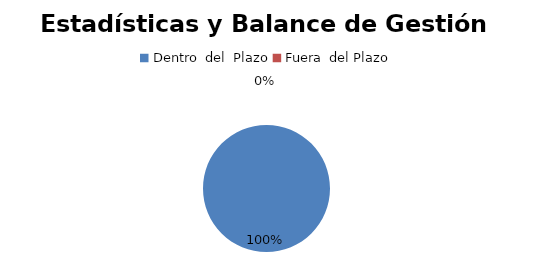
| Category | Series 0 |
|---|---|
| 0 | 5 |
| 1 | 0 |